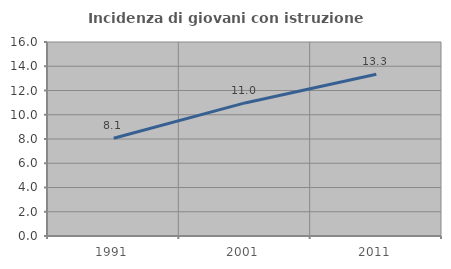
| Category | Incidenza di giovani con istruzione universitaria |
|---|---|
| 1991.0 | 8.065 |
| 2001.0 | 10.976 |
| 2011.0 | 13.333 |